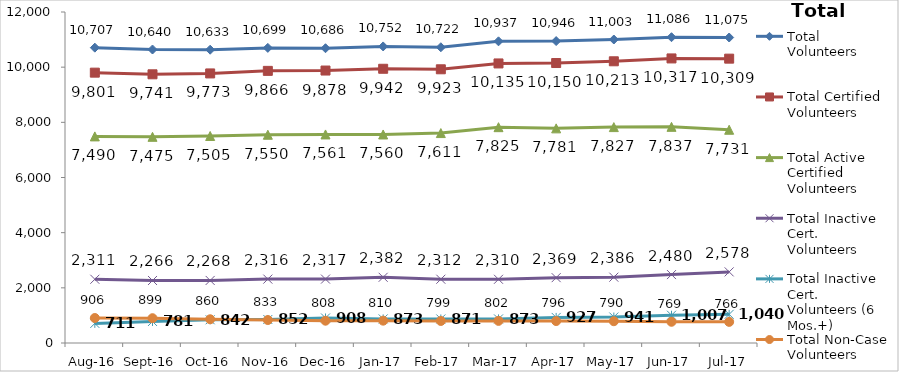
| Category | Total Volunteers | Total Certified Volunteers | Total Active Certified Volunteers | Total Inactive Cert. Volunteers | Total Inactive Cert. Volunteers (6 Mos.+) | Total Non-Case Volunteers |
|---|---|---|---|---|---|---|
| Aug-16 | 10707 | 9801 | 7490 | 2311 | 711 | 906 |
| Sep-16 | 10640 | 9741 | 7475 | 2266 | 781 | 899 |
| Oct-16 | 10633 | 9773 | 7505 | 2268 | 842 | 860 |
| Nov-16 | 10699 | 9866 | 7550 | 2316 | 852 | 833 |
| Dec-16 | 10686 | 9878 | 7561 | 2317 | 908 | 808 |
| Jan-17 | 10752 | 9942 | 7560 | 2382 | 873 | 810 |
| Feb-17 | 10722 | 9923 | 7611 | 2312 | 871 | 799 |
| Mar-17 | 10937 | 10135 | 7825 | 2310 | 873 | 802 |
| Apr-17 | 10946 | 10150 | 7781 | 2369 | 927 | 796 |
| May-17 | 11003 | 10213 | 7827 | 2386 | 941 | 790 |
| Jun-17 | 11086 | 10317 | 7837 | 2480 | 1007 | 769 |
| Jul-17 | 11075 | 10309 | 7731 | 2578 | 1040 | 766 |